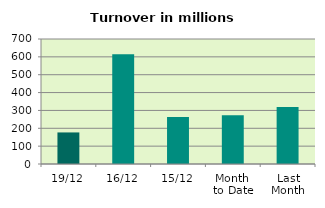
| Category | Series 0 |
|---|---|
| 19/12 | 176.745 |
| 16/12 | 614.95 |
| 15/12 | 263.539 |
| Month 
to Date | 273.416 |
| Last
Month | 319.611 |